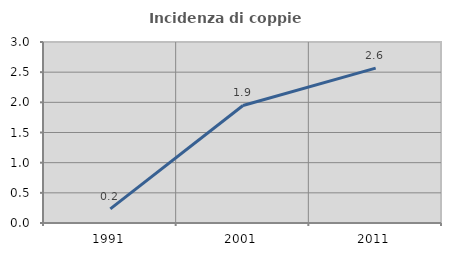
| Category | Incidenza di coppie miste |
|---|---|
| 1991.0 | 0.233 |
| 2001.0 | 1.948 |
| 2011.0 | 2.568 |